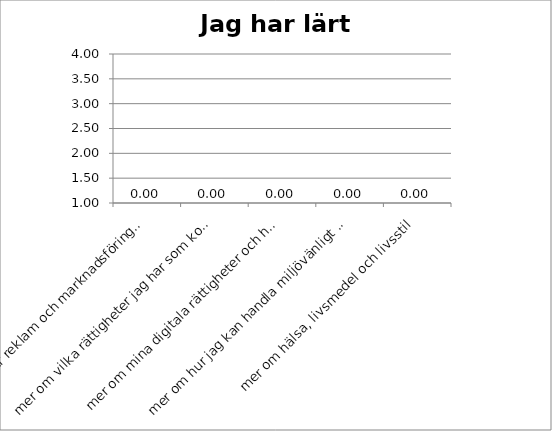
| Category | Series 0 |
|---|---|
| mer om hur reklam och marknadsföring påverkar mig | 0 |
| mer om vilka rättigheter jag har som konsument  | 0 |
| mer om mina digitala rättigheter och hur jag kan skydda min integritet på internet | 0 |
| mer om hur jag kan handla miljövänligt och hållbart | 0 |
| mer om hälsa, livsmedel och livsstil | 0 |